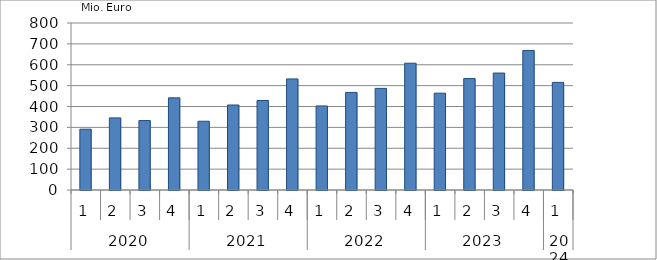
| Category | Ausbaugewerblicher Umsatz3 |
|---|---|
| 0 | 291272.144 |
| 1 | 345494.215 |
| 2 | 332629.265 |
| 3 | 441463.36 |
| 4 | 329380.212 |
| 5 | 407164.972 |
| 6 | 428783.222 |
| 7 | 532137.089 |
| 8 | 402625.565 |
| 9 | 467398.849 |
| 10 | 486819.26 |
| 11 | 607390.303 |
| 12 | 463895.067 |
| 13 | 533766.53 |
| 14 | 560194.5 |
| 15 | 668571.293 |
| 16 | 515461.734 |